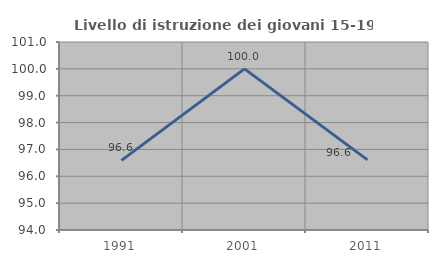
| Category | Livello di istruzione dei giovani 15-19 anni |
|---|---|
| 1991.0 | 96.591 |
| 2001.0 | 100 |
| 2011.0 | 96.61 |